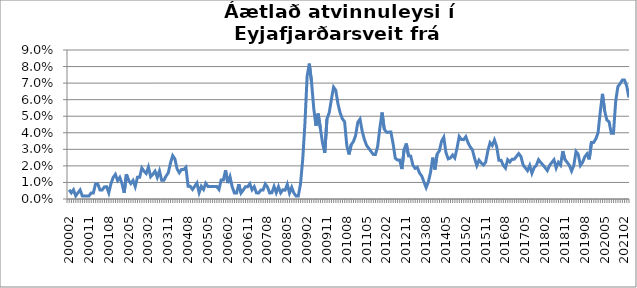
| Category | Series 0 |
|---|---|
| 200002 | 0.006 |
| 200003 | 0.004 |
| 200004 | 0.006 |
| 200005 | 0.002 |
| 200006 | 0.004 |
| 200007 | 0.005 |
| 200008 | 0.002 |
| 200009 | 0.002 |
| 200010 | 0.002 |
| 200011 | 0.002 |
| 200012 | 0.004 |
| 200101 | 0.004 |
| 200102 | 0.009 |
| 200103 | 0.009 |
| 200104 | 0.005 |
| 200105 | 0.005 |
| 200106 | 0.007 |
| 200107 | 0.007 |
| 200108 | 0.004 |
| 200109 | 0.009 |
| 200110 | 0.013 |
| 200111 | 0.015 |
| 200112 | 0.011 |
| 200201 | 0.013 |
| 200202 | 0.009 |
| 200203 | 0.004 |
| 200204 | 0.015 |
| 200205 | 0.011 |
| 200206 | 0.009 |
| 200207 | 0.011 |
| 200208 | 0.007 |
| 200209 | 0.013 |
| 200210 | 0.013 |
| 200211 | 0.019 |
| 200212 | 0.017 |
| 200301 | 0.015 |
| 200302 | 0.019 |
| 200303 | 0.013 |
| 200304 | 0.015 |
| 200305 | 0.017 |
| 200306 | 0.013 |
| 200307 | 0.017 |
| 200308 | 0.011 |
| 200309 | 0.011 |
| 200310 | 0.014 |
| 200311 | 0.016 |
| 200312 | 0.022 |
| 200401 | 0.026 |
| 200402 | 0.024 |
| 200403 | 0.018 |
| 200404 | 0.016 |
| 200405 | 0.018 |
| 200406 | 0.018 |
| 200407 | 0.019 |
| 200408 | 0.008 |
| 200409 | 0.008 |
| 200410 | 0.006 |
| 200411 | 0.008 |
| 200412 | 0.01 |
| 200501 | 0.004 |
| 200502 | 0.008 |
| 200503 | 0.006 |
| 200504 | 0.009 |
| 200505 | 0.008 |
| 200506 | 0.008 |
| 200507 | 0.007 |
| 200508 | 0.007 |
| 200509 | 0.007 |
| 200510 | 0.006 |
| 200511 | 0.012 |
| 200512 | 0.012 |
| 200601 | 0.017 |
| 200602 | 0.01 |
| 200603 | 0.013 |
| 200604 | 0.007 |
| 200605 | 0.004 |
| 200606 | 0.004 |
| 200607 | 0.009 |
| 200608 | 0.004 |
| 200609 | 0.005 |
| 200610 | 0.007 |
| 200611 | 0.007 |
| 200612 | 0.009 |
| 200701 | 0.006 |
| 200702 | 0.007 |
| 200703 | 0.004 |
| 200704 | 0.004 |
| 200705 | 0.005 |
| 200706 | 0.005 |
| 200707 | 0.009 |
| 200708 | 0.007 |
| 200709 | 0.004 |
| 200710 | 0.004 |
| 200711 | 0.008 |
| 200712 | 0.004 |
| 200801 | 0.007 |
| 200802 | 0.004 |
| 200803 | 0.006 |
| 200804 | 0.005 |
| 200805 | 0.009 |
| 200806 | 0.004 |
| 200807 | 0.007 |
| 200808 | 0.004 |
| 200809 | 0.002 |
| 200810 | 0.002 |
| 200811 | 0.009 |
| 200812 | 0.024 |
| 200901 | 0.046 |
| 200902 | 0.074 |
| 200903 | 0.082 |
| 200904 | 0.071 |
| 200905 | 0.055 |
| 200906 | 0.044 |
| 200907 | 0.052 |
| 200908 | 0.043 |
| 200909 | 0.034 |
| 200910 | 0.028 |
| 200911 | 0.048 |
| 200912 | 0.052 |
| 201001 | 0.06 |
| 201002 | 0.068 |
| 201003 | 0.066 |
| 201004 | 0.057 |
| 201005 | 0.052 |
| 201006 | 0.048 |
| 201007 | 0.047 |
| 201008 | 0.032 |
| 201009 | 0.027 |
| 201010 | 0.033 |
| 201011 | 0.035 |
| 201012 | 0.038 |
| 201101 | 0.046 |
| 201102 | 0.048 |
| 201103 | 0.041 |
| 201104 | 0.036 |
| 201105 | 0.032 |
| 201106 | 0.031 |
| 201107 | 0.029 |
| 201108 | 0.027 |
| 201109 | 0.027 |
| 201110 | 0.032 |
| 201111 | 0.043 |
| 201112 | 0.052 |
| 201201 | 0.042 |
| 201202 | 0.04 |
| 201203 | 0.04 |
| 201204 | 0.04 |
| 201205 | 0.033 |
| 201206 | 0.025 |
| 201207 | 0.024 |
| 201208 | 0.024 |
| 201209 | 0.018 |
| 201210 | 0.03 |
| 201211 | 0.034 |
| 201212 | 0.026 |
| 201301 | 0.026 |
| 201302 | 0.02 |
| 201303 | 0.019 |
| 201304 | 0.019 |
| 201305 | 0.016 |
| 201306 | 0.014 |
| 201307 | 0.01 |
| 201308 | 0.007 |
| 201309 | 0.01 |
| 201310 | 0.016 |
| 201311 | 0.025 |
| 201312 | 0.018 |
| 201401 | 0.027 |
| 201402 | 0.029 |
| 201403 | 0.035 |
| 201404 | 0.037 |
| 201405 | 0.028 |
| 201406 | 0.024 |
| 201407 | 0.025 |
| 201408 | 0.027 |
| 201409 | 0.025 |
| 201410 | 0.031 |
| 201411 | 0.038 |
| 201412 | 0.036 |
| 201501 | 0.036 |
| 201502 | 0.038 |
| 201503 | 0.034 |
| 201504 | 0.031 |
| 201505 | 0.03 |
| 201506 | 0.024 |
| 201507 | 0.02 |
| 201508 | 0.023 |
| 201509 | 0.022 |
| 201510 | 0.021 |
| 201511 | 0.022 |
| 201512 | 0.029 |
| 201601 | 0.034 |
| 201602 | 0.032 |
| 201603 | 0.036 |
| 201604 | 0.032 |
| 201605 | 0.023 |
| 201606 | 0.023 |
| 201607 | 0.02 |
| 201608 | 0.019 |
| 201609 | 0.024 |
| 201610 | 0.022 |
| 201611 | 0.024 |
| 201612 | 0.024 |
| 201701 | 0.026 |
| 201702 | 0.027 |
| 201703 | 0.026 |
| 201704 | 0.021 |
| 201705 | 0.019 |
| 201706 | 0.017 |
| 201707 | 0.02 |
| 201708 | 0.016 |
| 201709 | 0.019 |
| 201710 | 0.02 |
| 201711 | 0.024 |
| 201712 | 0.022 |
| 201801 | 0.021 |
| 201802 | 0.019 |
| 201803 | 0.017 |
| 201804 | 0.02 |
| 201805 | 0.022 |
| 201806 | 0.024 |
| 201807 | 0.019 |
| 201808 | 0.022 |
| 201809 | 0.02 |
| 201810 | 0.029 |
| 201811 | 0.024 |
| 201812 | 0.022 |
| 201901 | 0.02 |
| 201902 | 0.017 |
| 201903 | 0.02 |
| 201904 | 0.029 |
| 201905 | 0.027 |
| 201906 | 0.02 |
| 201907 | 0.022 |
| 201908 | 0.026 |
| 201909 | 0.027 |
| 201910 | 0.024 |
| 201911 | 0.034 |
| 201912 | 0.034 |
| 202001 | 0.036 |
| 202002 | 0.04 |
| 202003 | 0.053 |
| 202004 | 0.064 |
| 202005 | 0.053 |
| 202006 | 0.048 |
| 202007 | 0.047 |
| 202008 | 0.04 |
| 202009 | 0.04 |
| 202010 | 0.059 |
| 202011 | 0.068 |
| 202012 | 0.07 |
| 202101 | 0.072 |
| 202102 | 0.072 |
| 202103 | 0.068 |
| 202104 | 0.061 |